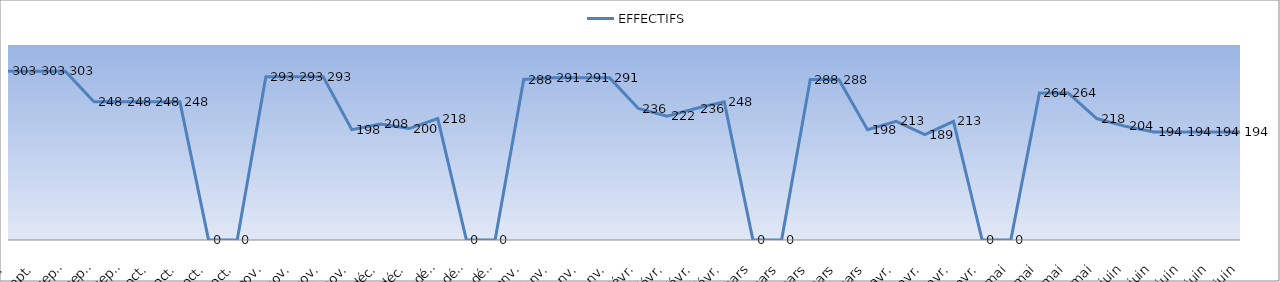
| Category | EFFECTIFS |
|---|---|
| 2013-09-02 | 303 |
| 2013-09-09 | 303 |
| 2013-09-16 | 303 |
| 2013-09-23 | 248 |
| 2013-09-30 | 248 |
| 2013-10-07 | 248 |
| 2013-10-14 | 248 |
| 2013-10-21 | 0 |
| 2013-10-28 | 0 |
| 2013-11-04 | 293 |
| 2013-11-11 | 293 |
| 2013-11-18 | 293 |
| 2013-11-25 | 198 |
| 2013-12-02 | 208 |
| 2013-12-09 | 200 |
| 2013-12-16 | 218 |
| 2013-12-23 | 0 |
| 2013-12-30 | 0 |
| 2014-01-06 | 288 |
| 2014-01-13 | 291 |
| 2014-01-20 | 291 |
| 2014-01-27 | 291 |
| 2014-02-03 | 236 |
| 2014-02-10 | 222 |
| 2014-02-17 | 236 |
| 2014-02-24 | 248 |
| 2014-03-03 | 0 |
| 2014-03-10 | 0 |
| 2014-03-17 | 288 |
| 2014-03-24 | 288 |
| 2014-03-31 | 198 |
| 2014-04-07 | 213 |
| 2014-04-14 | 189 |
| 2014-04-21 | 213 |
| 2014-04-28 | 0 |
| 2014-05-05 | 0 |
| 2014-05-12 | 264 |
| 2014-05-19 | 264 |
| 2014-05-26 | 218 |
| 2014-06-02 | 204 |
| 2014-06-09 | 194 |
| 2014-06-16 | 194 |
| 2014-06-23 | 194 |
| 2014-06-30 | 194 |